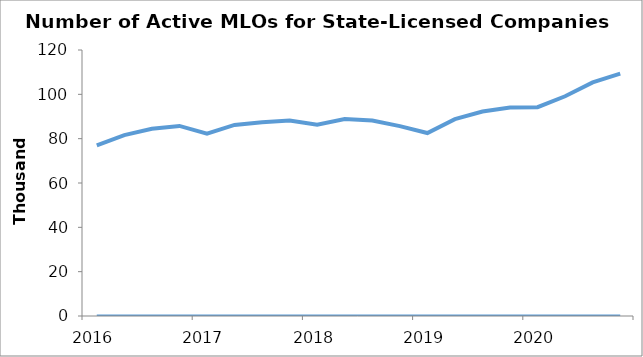
| Category | Quarter | Active MLOs |
|---|---|---|
| 2016.0 | 0 | 76959 |
| 2016.0 | 0 | 81606 |
| 2016.0 | 0 | 84484 |
| 2016.0 | 0 | 85755 |
| 2017.0 | 0 | 82276 |
| 2017.0 | 0 | 86190 |
| 2017.0 | 0 | 87405 |
| 2017.0 | 0 | 88205 |
| 2018.0 | 0 | 86269 |
| 2018.0 | 0 | 88855 |
| 2018.0 | 0 | 88147 |
| 2018.0 | 0 | 85647 |
| 2019.0 | 0 | 82551 |
| 2019.0 | 0 | 88822 |
| 2019.0 | 0 | 92224 |
| 2019.0 | 0 | 94044 |
| 2020.0 | 0 | 94196 |
| 2020.0 | 0 | 99123 |
| 2020.0 | 0 | 105394 |
| 2020.0 | 0 | 109301 |